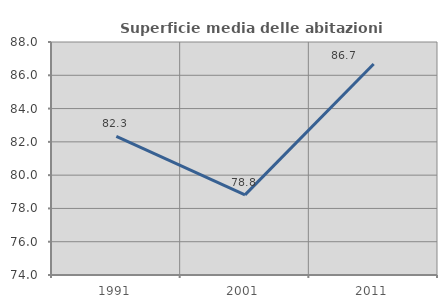
| Category | Superficie media delle abitazioni occupate |
|---|---|
| 1991.0 | 82.323 |
| 2001.0 | 78.815 |
| 2011.0 | 86.683 |